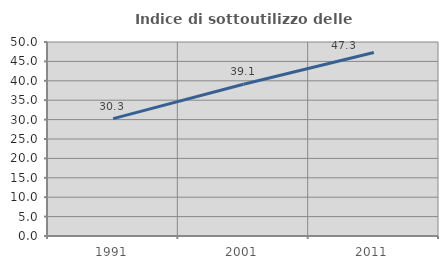
| Category | Indice di sottoutilizzo delle abitazioni  |
|---|---|
| 1991.0 | 30.26 |
| 2001.0 | 39.096 |
| 2011.0 | 47.282 |